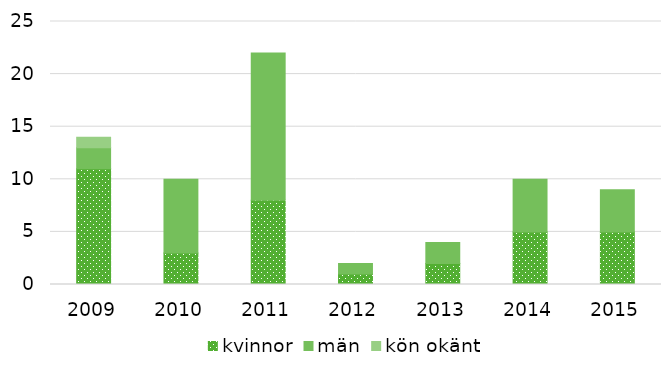
| Category | kvinnor | män | kön okänt |
|---|---|---|---|
| 2009.0 | 11 | 2 | 1 |
| 2010.0 | 3 | 7 | 0 |
| 2011.0 | 8 | 14 | 0 |
| 2012.0 | 1 | 1 | 0 |
| 2013.0 | 2 | 2 | 0 |
| 2014.0 | 5 | 5 | 0 |
| 2015.0 | 5 | 4 | 0 |